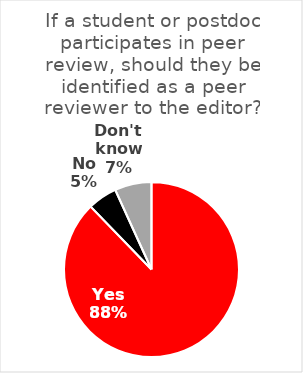
| Category | If a student or postdoc participates in peer review, should they be identified as a peer reviewer to the editor? |
|---|---|
| Yes | 258 |
| No | 16 |
| Don't know | 20 |